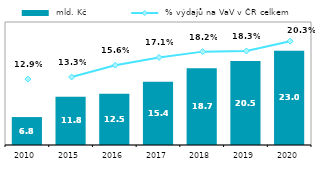
| Category |  mld. Kč |
|---|---|
| 2010.0 | 6.811 |
| 2015.0 | 11.763 |
| 2016.0 | 12.477 |
| 2017.0 | 15.448 |
| 2018.0 | 18.72 |
| 2019.0 | 20.474 |
| 2020.0 | 22.975 |